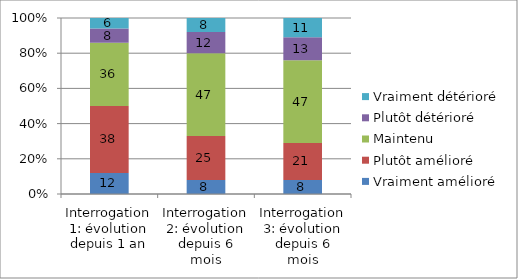
| Category | Vraiment amélioré | Plutôt amélioré | Maintenu | Plutôt détérioré | Vraiment détérioré |
|---|---|---|---|---|---|
| Interrogation 1: évolution depuis 1 an | 12 | 38 | 36 | 8 | 6 |
| Interrogation 2: évolution depuis 6 mois | 8 | 25 | 47 | 12 | 8 |
| Interrogation 3: évolution depuis 6 mois | 8 | 21 | 47 | 13 | 11 |